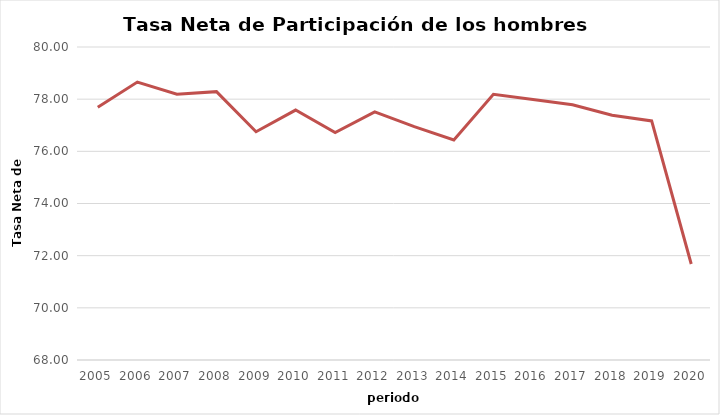
| Category | Hombres |
|---|---|
| 2005.0 | 77.693 |
| 2006.0 | 78.656 |
| 2007.0 | 78.19 |
| 2008.0 | 78.289 |
| 2009.0 | 76.753 |
| 2010.0 | 77.582 |
| 2011.0 | 76.718 |
| 2012.0 | 77.51 |
| 2013.0 | 76.948 |
| 2014.0 | 76.438 |
| 2015.0 | 78.186 |
| 2016.0 | 77.985 |
| 2017.0 | 77.784 |
| 2018.0 | 77.382 |
| 2019.0 | 77.165 |
| 2020.0 | 71.681 |